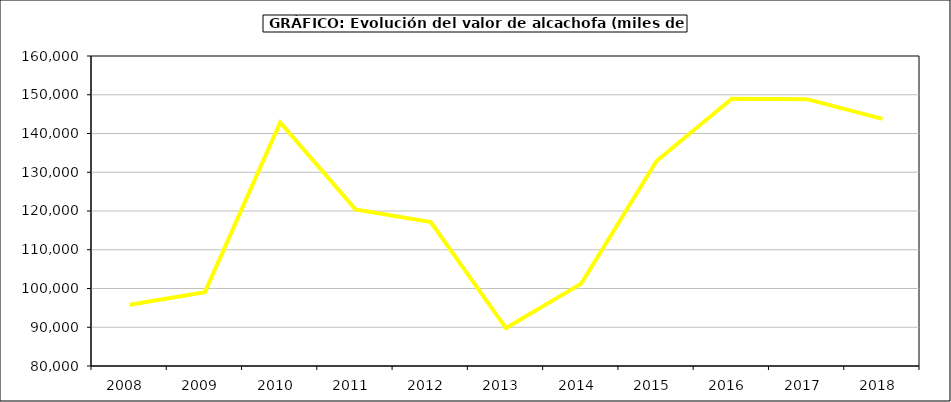
| Category | Valor |
|---|---|
| 2008.0 | 95815.761 |
| 2009.0 | 99068.13 |
| 2010.0 | 142879.333 |
| 2011.0 | 120418 |
| 2012.0 | 117146.597 |
| 2013.0 | 89795.299 |
| 2014.0 | 101254.898 |
| 2015.0 | 132897 |
| 2016.0 | 148974 |
| 2017.0 | 148863.365 |
| 2018.0 | 143776.931 |